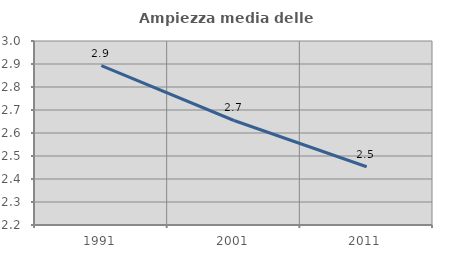
| Category | Ampiezza media delle famiglie |
|---|---|
| 1991.0 | 2.893 |
| 2001.0 | 2.654 |
| 2011.0 | 2.453 |